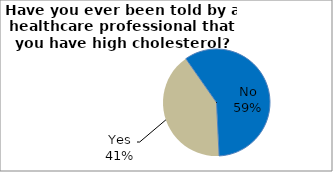
| Category | Series 0 |
|---|---|
| No | 58.94 |
| Yes | 41.06 |